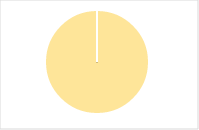
| Category | Total |
|---|---|
| Y | 0 |
| R | 0 |
| T | 0 |
| M | 0 |
| F | 0 |
| N | 136 |